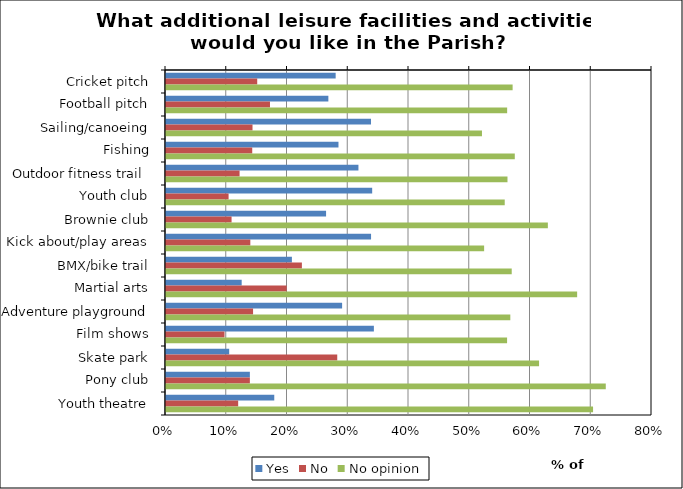
| Category | Yes | No | No opinion |
|---|---|---|---|
| Cricket pitch | 0.279 | 0.15 | 0.571 |
| Football pitch | 0.267 | 0.171 | 0.562 |
| Sailing/canoeing | 0.337 | 0.142 | 0.52 |
| Fishing | 0.284 | 0.142 | 0.574 |
| Outdoor fitness trail  | 0.317 | 0.121 | 0.562 |
| Youth club | 0.339 | 0.103 | 0.558 |
| Brownie club | 0.263 | 0.108 | 0.629 |
| Kick about/play areas | 0.338 | 0.139 | 0.524 |
| BMX/bike trail | 0.207 | 0.224 | 0.569 |
| Martial arts | 0.125 | 0.199 | 0.677 |
| Adventure playground | 0.29 | 0.143 | 0.567 |
| Film shows | 0.342 | 0.096 | 0.561 |
| Skate park | 0.104 | 0.282 | 0.614 |
| Pony club | 0.138 | 0.138 | 0.724 |
| Youth theatre | 0.178 | 0.119 | 0.703 |